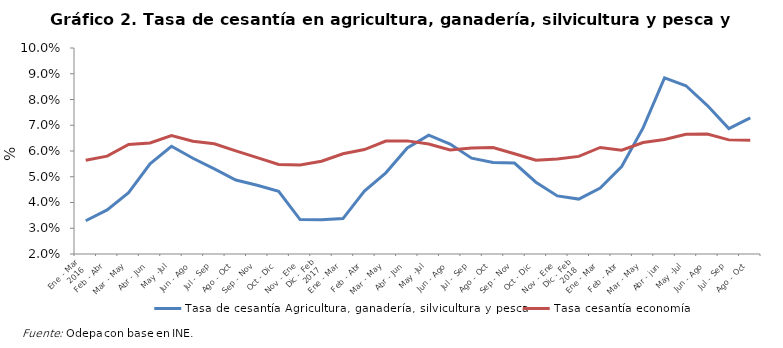
| Category | Tasa de cesantía Agricultura, ganadería, silvicultura y pesca |
|---|---|
| 0 | 0.033 |
| 1 | 0.037 |
| 2 | 0.044 |
| 3 | 0.055 |
| 4 | 0.062 |
| 5 | 0.057 |
| 6 | 0.053 |
| 7 | 0.049 |
| 8 | 0.047 |
| 9 | 0.044 |
| 10 | 0.033 |
| 11 | 0.033 |
| 12 | 0.034 |
| 13 | 0.044 |
| 14 | 0.052 |
| 15 | 0.061 |
| 16 | 0.066 |
| 17 | 0.063 |
| 18 | 0.057 |
| 19 | 0.055 |
| 20 | 0.055 |
| 21 | 0.048 |
| 22 | 0.043 |
| 23 | 0.041 |
| 24 | 0.046 |
| 25 | 0.054 |
| 26 | 0.069 |
| 27 | 0.088 |
| 28 | 0.085 |
| 29 | 0.078 |
| 30 | 0.069 |
| 31 | 0.073 |